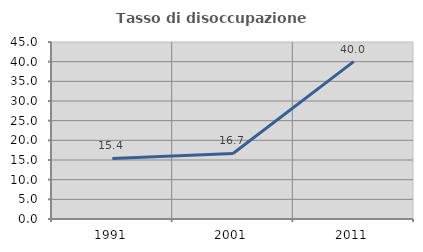
| Category | Tasso di disoccupazione giovanile  |
|---|---|
| 1991.0 | 15.385 |
| 2001.0 | 16.667 |
| 2011.0 | 40 |